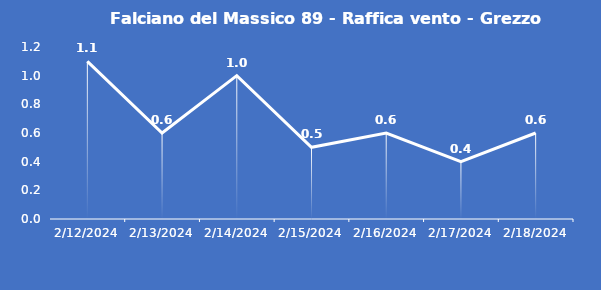
| Category | Falciano del Massico 89 - Raffica vento - Grezzo (m/s) |
|---|---|
| 2/12/24 | 1.1 |
| 2/13/24 | 0.6 |
| 2/14/24 | 1 |
| 2/15/24 | 0.5 |
| 2/16/24 | 0.6 |
| 2/17/24 | 0.4 |
| 2/18/24 | 0.6 |